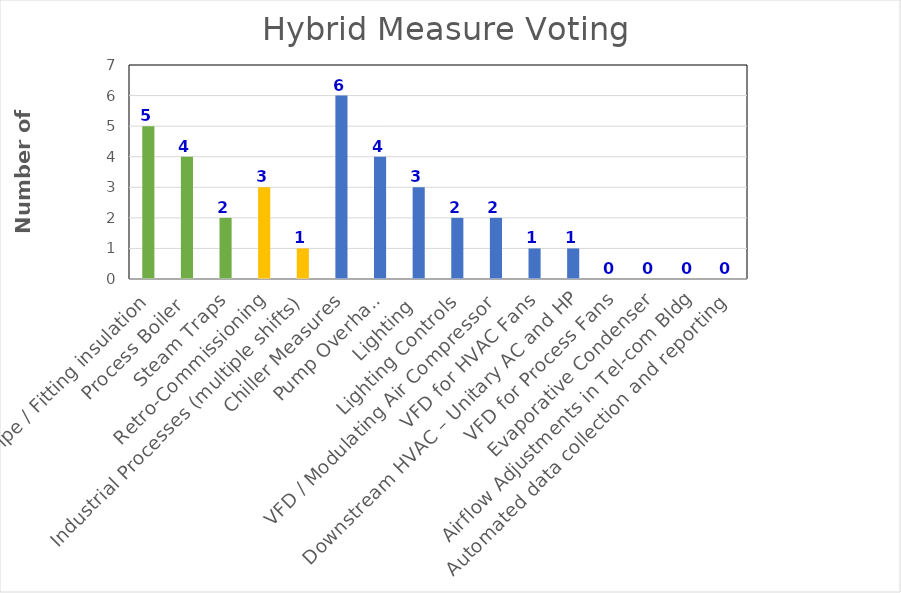
| Category | count |
|---|---|
| Pipe / Fitting insulation | 5 |
| Process Boiler | 4 |
| Steam Traps | 2 |
| Retro-Commissioning | 3 |
| Industrial Processes (multiple shifts) | 1 |
| Chiller Measures | 6 |
| Pump Overhaul | 4 |
| Lighting | 3 |
| Lighting Controls | 2 |
| VFD / Modulating Air Compressor | 2 |
| VFD for HVAC Fans | 1 |
| Downstream HVAC – Unitary AC and HP | 1 |
| VFD for Process Fans | 0 |
| Evaporative Condenser | 0 |
| Airflow Adjustments in Tel-com Bldg | 0 |
| Automated data collection and reporting | 0 |